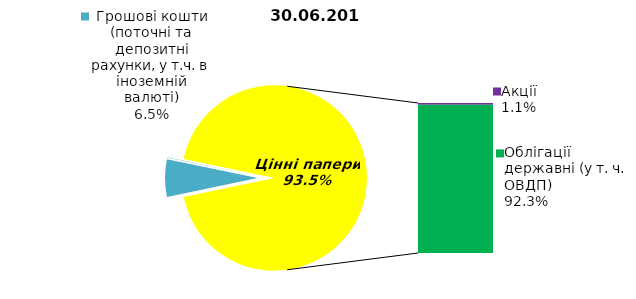
| Category | Series 0 |
|---|---|
| Грошові кошти (поточні та депозитні рахунки, у т.ч. в іноземній валюті) | 7.05 |
| Банківські метали | 0 |
| Нерухомість | 0 |
| Інші активи | -0.043 |
| Акції | 1.198 |
| Облігації підприємств | 0 |
| Муніципальні облігації | 0 |
| Облігації державні (у т. ч. ОВДП) | 99.382 |
| Іпотечні сертифікати | 0 |